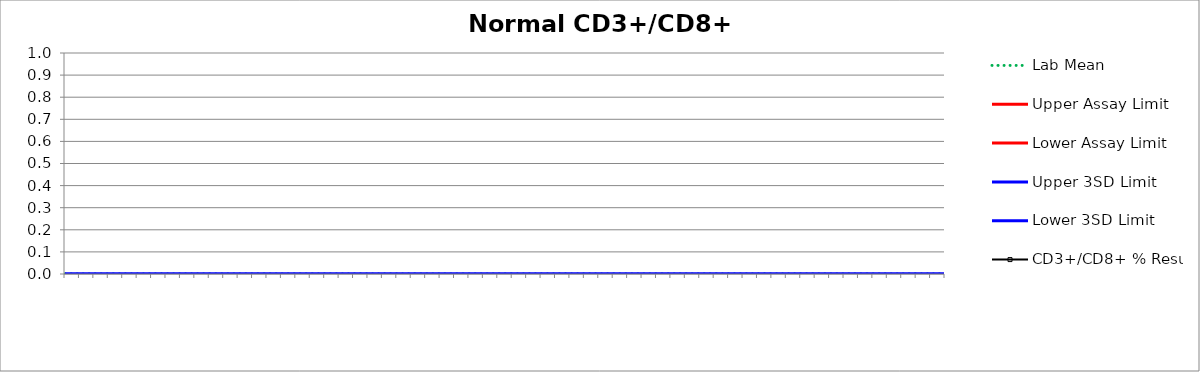
| Category | Lab Mean | Upper Assay Limit | Lower Assay Limit | Upper 3SD Limit | Lower 3SD Limit | CD3+/CD8+ % Result |
|---|---|---|---|---|---|---|
|  | 0 |  |  | 0 | 0 |  |
|  | 0 |  |  | 0 | 0 |  |
|  | 0 |  |  | 0 | 0 |  |
|  | 0 |  |  | 0 | 0 |  |
|  | 0 |  |  | 0 | 0 |  |
|  | 0 |  |  | 0 | 0 |  |
|  | 0 |  |  | 0 | 0 |  |
|  | 0 |  |  | 0 | 0 |  |
|  | 0 |  |  | 0 | 0 |  |
|  | 0 |  |  | 0 | 0 |  |
|  | 0 |  |  | 0 | 0 |  |
|  | 0 |  |  | 0 | 0 |  |
|  | 0 |  |  | 0 | 0 |  |
|  | 0 |  |  | 0 | 0 |  |
|  | 0 |  |  | 0 | 0 |  |
|  | 0 |  |  | 0 | 0 |  |
|  | 0 |  |  | 0 | 0 |  |
|  | 0 |  |  | 0 | 0 |  |
|  | 0 |  |  | 0 | 0 |  |
|  | 0 |  |  | 0 | 0 |  |
|  | 0 |  |  | 0 | 0 |  |
|  | 0 |  |  | 0 | 0 |  |
|  | 0 |  |  | 0 | 0 |  |
|  | 0 |  |  | 0 | 0 |  |
|  | 0 |  |  | 0 | 0 |  |
|  | 0 |  |  | 0 | 0 |  |
|  | 0 |  |  | 0 | 0 |  |
|  | 0 |  |  | 0 | 0 |  |
|  | 0 |  |  | 0 | 0 |  |
|  | 0 |  |  | 0 | 0 |  |
|  | 0 |  |  | 0 | 0 |  |
|  | 0 |  |  | 0 | 0 |  |
|  | 0 |  |  | 0 | 0 |  |
|  | 0 |  |  | 0 | 0 |  |
|  | 0 |  |  | 0 | 0 |  |
|  | 0 |  |  | 0 | 0 |  |
|  | 0 |  |  | 0 | 0 |  |
|  | 0 |  |  | 0 | 0 |  |
|  | 0 |  |  | 0 | 0 |  |
|  | 0 |  |  | 0 | 0 |  |
|  | 0 |  |  | 0 | 0 |  |
|  | 0 |  |  | 0 | 0 |  |
|  | 0 |  |  | 0 | 0 |  |
|  | 0 |  |  | 0 | 0 |  |
|  | 0 |  |  | 0 | 0 |  |
|  | 0 |  |  | 0 | 0 |  |
|  | 0 |  |  | 0 | 0 |  |
|  | 0 |  |  | 0 | 0 |  |
|  | 0 |  |  | 0 | 0 |  |
|  | 0 |  |  | 0 | 0 |  |
|  | 0 |  |  | 0 | 0 |  |
|  | 0 |  |  | 0 | 0 |  |
|  | 0 |  |  | 0 | 0 |  |
|  | 0 |  |  | 0 | 0 |  |
|  | 0 |  |  | 0 | 0 |  |
|  | 0 |  |  | 0 | 0 |  |
|  | 0 |  |  | 0 | 0 |  |
|  | 0 |  |  | 0 | 0 |  |
|  | 0 |  |  | 0 | 0 |  |
|  | 0 |  |  | 0 | 0 |  |
|  | 0 |  |  | 0 | 0 |  |
|  | 0 |  |  | 0 | 0 |  |